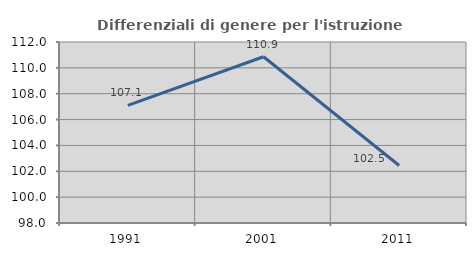
| Category | Differenziali di genere per l'istruzione superiore |
|---|---|
| 1991.0 | 107.095 |
| 2001.0 | 110.86 |
| 2011.0 | 102.45 |